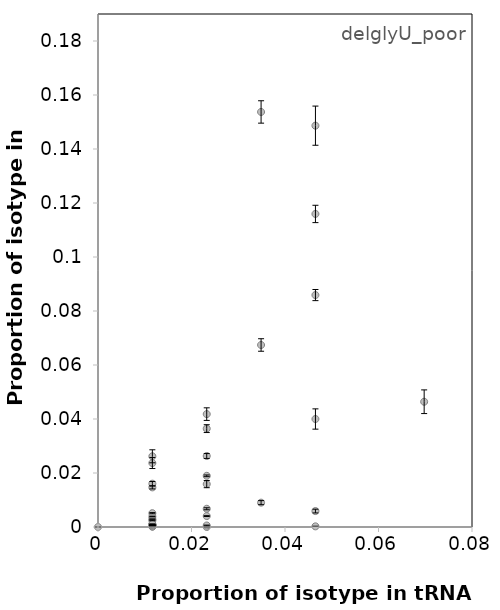
| Category | SBW25 |
|---|---|
| 0.023255813953488372 | 0.026 |
| 0.03488372093023256 | 0.067 |
| 0.046511627906976744 | 0.006 |
| 0.011627906976744186 | 0.001 |
| 0.011627906976744186 | 0 |
| 0.011627906976744186 | 0.004 |
| 0.046511627906976744 | 0.086 |
| 0.03488372093023256 | 0.154 |
| 0.011627906976744186 | 0.015 |
| 0.046511627906976744 | 0 |
| 0.023255813953488372 | 0.036 |
| 0.023255813953488372 | 0.042 |
| 0.046511627906976744 | 0.116 |
| 0.0 | 0 |
| 0.046511627906976744 | 0.149 |
| 0.011627906976744186 | 0.016 |
| 0.011627906976744186 | 0 |
| 0.023255813953488372 | 0 |
| 0.03488372093023256 | 0.009 |
| 0.011627906976744186 | 0.001 |
| 0.046511627906976744 | 0.04 |
| 0.011627906976744186 | 0.001 |
| 0.011627906976744186 | 0 |
| 0.011627906976744186 | 0.005 |
| 0.06976744186046512 | 0.046 |
| 0.023255813953488372 | 0.007 |
| 0.023255813953488372 | 0.001 |
| 0.011627906976744186 | 0.001 |
| 0.011627906976744186 | 0.002 |
| 0.011627906976744186 | 0.003 |
| 0.011627906976744186 | 0 |
| 0.011627906976744186 | 0 |
| 0.011627906976744186 | 0.024 |
| 0.023255813953488372 | 0.019 |
| 0.011627906976744186 | 0.001 |
| 0.023255813953488372 | 0.004 |
| 0.023255813953488372 | 0.016 |
| 0.011627906976744186 | 0.026 |
| 0.011627906976744186 | 0.001 |